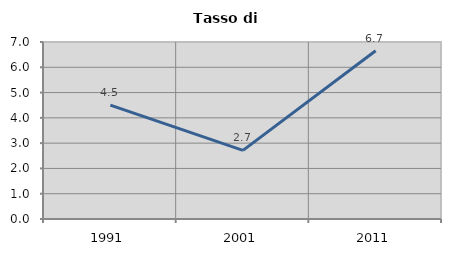
| Category | Tasso di disoccupazione   |
|---|---|
| 1991.0 | 4.503 |
| 2001.0 | 2.713 |
| 2011.0 | 6.655 |